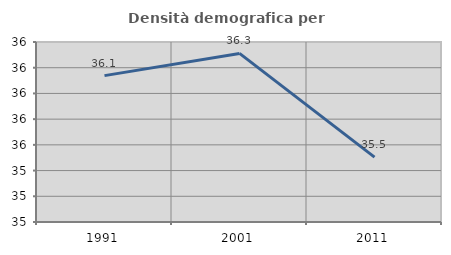
| Category | Densità demografica |
|---|---|
| 1991.0 | 36.138 |
| 2001.0 | 36.311 |
| 2011.0 | 35.504 |